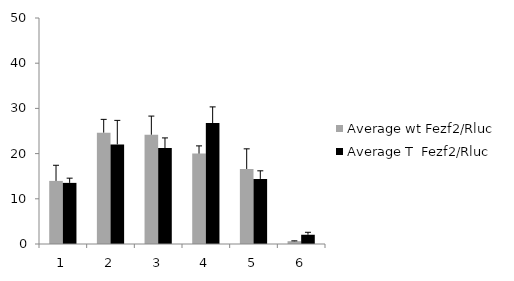
| Category | Average wt Fezf2/Rluc | Average T  Fezf2/Rluc |
|---|---|---|
| 0 | 13.958 | 13.521 |
| 1 | 24.639 | 22.037 |
| 2 | 24.184 | 21.233 |
| 3 | 20.004 | 26.771 |
| 4 | 16.597 | 14.392 |
| 5 | 0.619 | 2.046 |